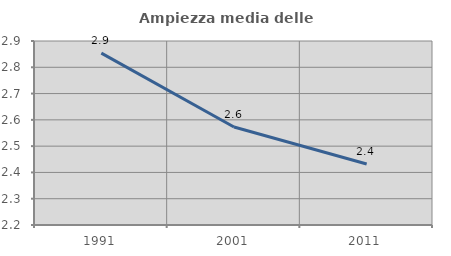
| Category | Ampiezza media delle famiglie |
|---|---|
| 1991.0 | 2.854 |
| 2001.0 | 2.573 |
| 2011.0 | 2.432 |